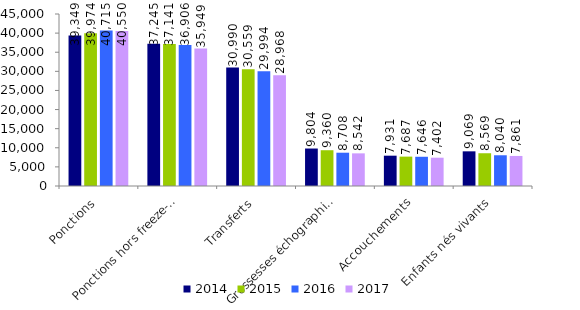
| Category | 2014 | 2015 | 2016 | 2017 |
|---|---|---|---|---|
| Ponctions | 39349 | 39974 | 40715 | 40550 |
| Ponctions hors freeze-all* | 37245 | 37141 | 36906 | 35949 |
| Transferts | 30990 | 30559 | 29994 | 28968 |
| Grossesses échographiques | 9804 | 9360 | 8708 | 8542 |
| Accouchements | 7931 | 7687 | 7646 | 7402 |
| Enfants nés vivants | 9069 | 8569 | 8040 | 7861 |